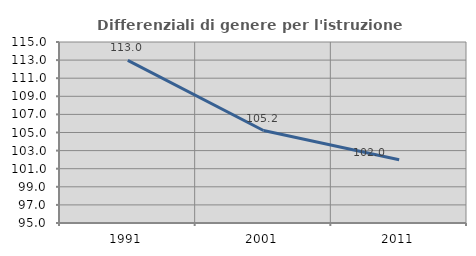
| Category | Differenziali di genere per l'istruzione superiore |
|---|---|
| 1991.0 | 112.974 |
| 2001.0 | 105.217 |
| 2011.0 | 101.987 |